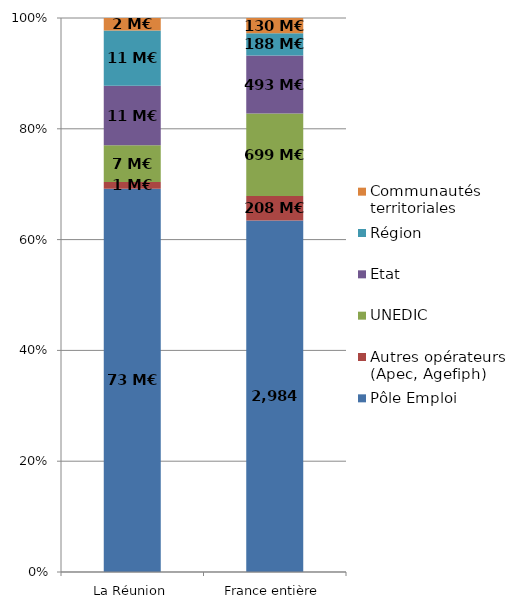
| Category | Pôle Emploi | Autres opérateurs (Apec, Agefiph) | UNEDIC | Etat | Région | Communautés territoriales |
|---|---|---|---|---|---|---|
| La Réunion | 72.873 | 1.283 | 6.967 | 11.337 | 10.524 | 2.354 |
| France entière | 2983.694 | 207.577 | 699.479 | 493.308 | 188.079 | 129.71 |